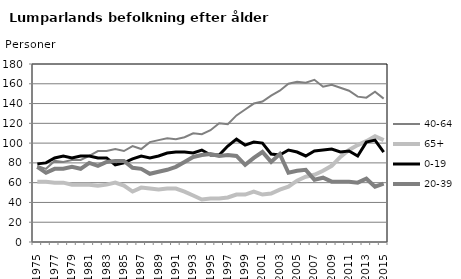
| Category | 40-64 | 65+ | 0-19 | 20-39 |
|---|---|---|---|---|
| 1975.0 | 77 | 61 | 79 | 76 |
| 1976.0 | 74 | 61 | 80 | 70 |
| 1977.0 | 82 | 60 | 85 | 74 |
| 1978.0 | 81 | 60 | 87 | 74 |
| 1979.0 | 83 | 58 | 85 | 76 |
| 1980.0 | 83 | 58 | 87 | 74 |
| 1981.0 | 87 | 58 | 87 | 80 |
| 1982.0 | 92 | 57 | 85 | 77 |
| 1983.0 | 92 | 58 | 85 | 81 |
| 1984.0 | 94 | 60 | 78 | 82 |
| 1985.0 | 92 | 57 | 80 | 82 |
| 1986.0 | 97 | 51 | 84 | 75 |
| 1987.0 | 94 | 55 | 87 | 74 |
| 1988.0 | 101 | 54 | 85 | 69 |
| 1989.0 | 103 | 53 | 87 | 71 |
| 1990.0 | 105 | 54 | 90 | 73 |
| 1991.0 | 104 | 54 | 91 | 76 |
| 1992.0 | 106 | 51 | 91 | 81 |
| 1993.0 | 110 | 47 | 90 | 86 |
| 1994.0 | 109 | 43 | 93 | 88 |
| 1995.0 | 113 | 44 | 88 | 89 |
| 1996.0 | 120 | 44 | 88 | 87 |
| 1997.0 | 119 | 45 | 97 | 88 |
| 1998.0 | 128 | 48 | 104 | 87 |
| 1999.0 | 134 | 48 | 98 | 78 |
| 2000.0 | 140 | 51 | 101 | 85 |
| 2001.0 | 142 | 48 | 100 | 91 |
| 2002.0 | 148 | 49 | 89 | 81 |
| 2003.0 | 153 | 53 | 88 | 89 |
| 2004.0 | 160 | 56 | 93 | 70 |
| 2005.0 | 162 | 62 | 91 | 72 |
| 2006.0 | 161 | 66 | 87 | 73 |
| 2007.0 | 164 | 68 | 92 | 63 |
| 2008.0 | 157 | 72 | 93 | 65 |
| 2009.0 | 159 | 77 | 94 | 61 |
| 2010.0 | 156 | 86 | 91 | 61 |
| 2011.0 | 153 | 93 | 92 | 61 |
| 2012.0 | 147 | 98 | 87 | 60 |
| 2013.0 | 146 | 102 | 101 | 64 |
| 2014.0 | 152 | 107 | 103 | 56 |
| 2015.0 | 145 | 103 | 91 | 59 |